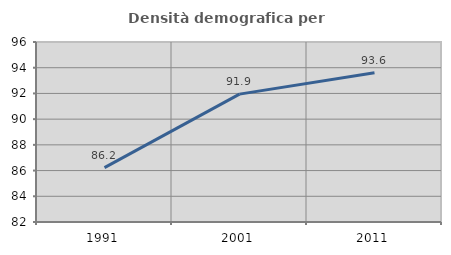
| Category | Densità demografica |
|---|---|
| 1991.0 | 86.23 |
| 2001.0 | 91.945 |
| 2011.0 | 93.602 |